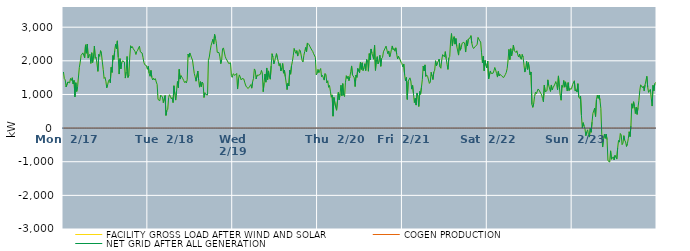
| Category | FACILITY GROSS LOAD AFTER WIND AND SOLAR | COGEN PRODUCTION | NET GRID AFTER ALL GENERATION |
|---|---|---|---|
|  Mon  2/17 | 1668 | 0 | 1668 |
|  Mon  2/17 | 1466 | 0 | 1466 |
|  Mon  2/17 | 1435 | 0 | 1435 |
|  Mon  2/17 | 1223 | 0 | 1223 |
|  Mon  2/17 | 1209 | 0 | 1209 |
|  Mon  2/17 | 1372 | 0 | 1372 |
|  Mon  2/17 | 1377 | 0 | 1377 |
|  Mon  2/17 | 1343 | 0 | 1343 |
|  Mon  2/17 | 1476 | 0 | 1476 |
|  Mon  2/17 | 1417 | 0 | 1417 |
|  Mon  2/17 | 1497 | 0 | 1497 |
|  Mon  2/17 | 1312 | 0 | 1312 |
|  Mon  2/17 | 1415 | 0 | 1415 |
|  Mon  2/17 | 928 | 0 | 928 |
|  Mon  2/17 | 1349 | 0 | 1349 |
|  Mon  2/17 | 1090 | 0 | 1090 |
|  Mon  2/17 | 1233 | 0 | 1233 |
|  Mon  2/17 | 1243 | 0 | 1243 |
|  Mon  2/17 | 1807 | 0 | 1807 |
|  Mon  2/17 | 1965 | 0 | 1965 |
|  Mon  2/17 | 2161 | 0 | 2161 |
|  Mon  2/17 | 2158 | 0 | 2158 |
|  Mon  2/17 | 2236 | 0 | 2236 |
|  Mon  2/17 | 2240 | 0 | 2240 |
|  Mon  2/17 | 2091 | 0 | 2091 |
|  Mon  2/17 | 2475 | 0 | 2475 |
|  Mon  2/17 | 2226 | 0 | 2226 |
|  Mon  2/17 | 2500 | 0 | 2500 |
|  Mon  2/17 | 2082 | 0 | 2082 |
|  Mon  2/17 | 2163 | 0 | 2163 |
|  Mon  2/17 | 2196 | 0 | 2196 |
|  Mon  2/17 | 1923 | 0 | 1923 |
|  Mon  2/17 | 2239 | 0 | 2239 |
|  Mon  2/17 | 1948 | 0 | 1948 |
|  Mon  2/17 | 2140 | 0 | 2140 |
|  Mon  2/17 | 2438 | 0 | 2438 |
|  Mon  2/17 | 2075 | 0 | 2075 |
|  Mon  2/17 | 2105 | 0 | 2105 |
|  Mon  2/17 | 2108 | 0 | 2108 |
|  Mon  2/17 | 1687 | 0 | 1687 |
|  Mon  2/17 | 2190 | 0 | 2190 |
|  Mon  2/17 | 2135 | 0 | 2135 |
|  Mon  2/17 | 2302 | 0 | 2302 |
|  Mon  2/17 | 2210 | 0 | 2210 |
|  Mon  2/17 | 1966 | 0 | 1966 |
|  Mon  2/17 | 1742 | 0 | 1742 |
|  Mon  2/17 | 1477 | 0 | 1477 |
|  Mon  2/17 | 1508 | 0 | 1508 |
|  Mon  2/17 | 1395 | 0 | 1395 |
|  Mon  2/17 | 1198 | 0 | 1198 |
|  Mon  2/17 | 1291 | 0 | 1291 |
|  Mon  2/17 | 1396 | 0 | 1396 |
|  Mon  2/17 | 1446 | 0 | 1446 |
|  Mon  2/17 | 1346 | 0 | 1346 |
|  Mon  2/17 | 1807 | 0 | 1807 |
|  Mon  2/17 | 1655 | 0 | 1655 |
|  Mon  2/17 | 2157 | 0 | 2157 |
|  Mon  2/17 | 2039 | 0 | 2039 |
|  Mon  2/17 | 2305 | 0 | 2305 |
|  Mon  2/17 | 2492 | 0 | 2492 |
|  Mon  2/17 | 2362 | 0 | 2362 |
|  Mon  2/17 | 2593 | 0 | 2593 |
|  Mon  2/17 | 2104 | 0 | 2104 |
|  Mon  2/17 | 1607 | 0 | 1607 |
|  Mon  2/17 | 2065 | 0 | 2065 |
|  Mon  2/17 | 1761 | 0 | 1761 |
|  Mon  2/17 | 1957 | 0 | 1957 |
|  Mon  2/17 | 2000 | 0 | 2000 |
|  Mon  2/17 | 2001 | 0 | 2001 |
|  Mon  2/17 | 1963 | 0 | 1963 |
|  Mon  2/17 | 1487 | 0 | 1487 |
|  Mon  2/17 | 1671 | 0 | 1671 |
|  Mon  2/17 | 2128 | 0 | 2128 |
|  Mon  2/17 | 1506 | 0 | 1506 |
|  Mon  2/17 | 1571 | 0 | 1571 |
|  Mon  2/17 | 2113 | 0 | 2113 |
|  Mon  2/17 | 2447 | 0 | 2447 |
|  Mon  2/17 | 2381 | 0 | 2381 |
|  Mon  2/17 | 2421 | 0 | 2421 |
|  Mon  2/17 | 2356 | 0 | 2356 |
|  Mon  2/17 | 2320 | 0 | 2320 |
|  Mon  2/17 | 2275 | 0 | 2275 |
|  Mon  2/17 | 2188 | 0 | 2188 |
|  Mon  2/17 | 2280 | 0 | 2280 |
|  Mon  2/17 | 2313 | 0 | 2313 |
|  Mon  2/17 | 2383 | 0 | 2383 |
|  Mon  2/17 | 2434 | 0 | 2434 |
|  Mon  2/17 | 2266 | 0 | 2266 |
|  Mon  2/17 | 2277 | 0 | 2277 |
|  Mon  2/17 | 2232 | 0 | 2232 |
|  Mon  2/17 | 2101 | 0 | 2101 |
|  Mon  2/17 | 1952 | 0 | 1952 |
|  Mon  2/17 | 1884 | 0 | 1884 |
|  Mon  2/17 | 1911 | 0 | 1911 |
|  Mon  2/17 | 1853 | 0 | 1853 |
|  Mon  2/17 | 1748 | 0 | 1748 |
|  Tue  2/18 | 1839 | 0 | 1839 |
|  Tue  2/18 | 1633 | 0 | 1633 |
|  Tue  2/18 | 1542 | 0 | 1542 |
|  Tue  2/18 | 1714 | 0 | 1714 |
|  Tue  2/18 | 1506 | 0 | 1506 |
|  Tue  2/18 | 1431 | 0 | 1431 |
|  Tue  2/18 | 1483 | 0 | 1483 |
|  Tue  2/18 | 1432 | 0 | 1432 |
|  Tue  2/18 | 1469 | 0 | 1469 |
|  Tue  2/18 | 1370 | 0 | 1370 |
|  Tue  2/18 | 1298 | 0 | 1298 |
|  Tue  2/18 | 852 | 0 | 852 |
|  Tue  2/18 | 879 | 0 | 879 |
|  Tue  2/18 | 813 | 0 | 813 |
|  Tue  2/18 | 980 | 0 | 980 |
|  Tue  2/18 | 955 | 0 | 955 |
|  Tue  2/18 | 923 | 0 | 923 |
|  Tue  2/18 | 757 | 0 | 757 |
|  Tue  2/18 | 760 | 0 | 760 |
|  Tue  2/18 | 967 | 0 | 967 |
|  Tue  2/18 | 377 | 0 | 377 |
|  Tue  2/18 | 525 | 0 | 525 |
|  Tue  2/18 | 559 | 0 | 559 |
|  Tue  2/18 | 909 | 0 | 909 |
|  Tue  2/18 | 990 | 0 | 990 |
|  Tue  2/18 | 945 | 0 | 945 |
|  Tue  2/18 | 871 | 0 | 871 |
|  Tue  2/18 | 906 | 0 | 906 |
|  Tue  2/18 | 758 | 0 | 758 |
|  Tue  2/18 | 1258 | 0 | 1258 |
|  Tue  2/18 | 1016 | 0 | 1016 |
|  Tue  2/18 | 832 | 0 | 832 |
|  Tue  2/18 | 1120 | 0 | 1120 |
|  Tue  2/18 | 1384 | 0 | 1384 |
|  Tue  2/18 | 1200 | 0 | 1200 |
|  Tue  2/18 | 1746 | 0 | 1746 |
|  Tue  2/18 | 1457 | 0 | 1457 |
|  Tue  2/18 | 1559 | 0 | 1559 |
|  Tue  2/18 | 1517 | 0 | 1517 |
|  Tue  2/18 | 1468 | 0 | 1468 |
|  Tue  2/18 | 1416 | 0 | 1416 |
|  Tue  2/18 | 1356 | 0 | 1356 |
|  Tue  2/18 | 1387 | 0 | 1387 |
|  Tue  2/18 | 1340 | 0 | 1340 |
|  Tue  2/18 | 1436 | 0 | 1436 |
|  Tue  2/18 | 2199 | 0 | 2199 |
|  Tue  2/18 | 2108 | 0 | 2108 |
|  Tue  2/18 | 2233 | 0 | 2233 |
|  Tue  2/18 | 2243 | 0 | 2243 |
|  Tue  2/18 | 2086 | 0 | 2086 |
|  Tue  2/18 | 2020 | 0 | 2020 |
|  Tue  2/18 | 2032 | 0 | 2032 |
|  Tue  2/18 | 1625 | 0 | 1625 |
|  Tue  2/18 | 1526 | 0 | 1526 |
|  Tue  2/18 | 1394 | 0 | 1394 |
|  Tue  2/18 | 1370 | 0 | 1370 |
|  Tue  2/18 | 1694 | 0 | 1694 |
|  Tue  2/18 | 1416 | 0 | 1416 |
|  Tue  2/18 | 1217 | 0 | 1217 |
|  Tue  2/18 | 1380 | 0 | 1380 |
|  Tue  2/18 | 1230 | 0 | 1230 |
|  Tue  2/18 | 1370 | 0 | 1370 |
|  Tue  2/18 | 1326 | 0 | 1326 |
|  Tue  2/18 | 910 | 0 | 910 |
|  Tue  2/18 | 1052 | 0 | 1052 |
|  Tue  2/18 | 1000 | 0 | 1000 |
|  Tue  2/18 | 994 | 0 | 994 |
|  Tue  2/18 | 984 | 0 | 984 |
|  Tue  2/18 | 2013 | 0 | 2013 |
|  Tue  2/18 | 2111 | 0 | 2111 |
|  Tue  2/18 | 2296 | 0 | 2296 |
|  Tue  2/18 | 2450 | 0 | 2450 |
|  Tue  2/18 | 2439 | 0 | 2439 |
|  Tue  2/18 | 2637 | 0 | 2637 |
|  Tue  2/18 | 2498 | 0 | 2498 |
|  Tue  2/18 | 2785 | 0 | 2785 |
|  Tue  2/18 | 2671 | 0 | 2671 |
|  Tue  2/18 | 2523 | 0 | 2523 |
|  Tue  2/18 | 2252 | 0 | 2252 |
|  Tue  2/18 | 2264 | 0 | 2264 |
|  Tue  2/18 | 2245 | 0 | 2245 |
|  Tue  2/18 | 2116 | 0 | 2116 |
|  Tue  2/18 | 1915 | 0 | 1915 |
|  Tue  2/18 | 2027 | 0 | 2027 |
|  Tue  2/18 | 2353 | 0 | 2353 |
|  Tue  2/18 | 2384 | 0 | 2384 |
|  Tue  2/18 | 2382 | 0 | 2382 |
|  Tue  2/18 | 2133 | 0 | 2133 |
|  Tue  2/18 | 2062 | 0 | 2062 |
|  Tue  2/18 | 2019 | 0 | 2019 |
|  Tue  2/18 | 1998 | 0 | 1998 |
|  Tue  2/18 | 1919 | 0 | 1919 |
|  Tue  2/18 | 1948 | 0 | 1948 |
|  Tue  2/18 | 1940 | 0 | 1940 |
|  Tue  2/18 | 1557 | 0 | 1557 |
|  Tue  2/18 | 1509 | 0 | 1509 |
|  Wed  2/19 | 1616 | 0 | 1616 |
|  Wed  2/19 | 1636 | 0 | 1636 |
|  Wed  2/19 | 1566 | 0 | 1566 |
|  Wed  2/19 | 1560 | 0 | 1560 |
|  Wed  2/19 | 1624 | 0 | 1624 |
|  Wed  2/19 | 1161 | 0 | 1161 |
|  Wed  2/19 | 1460 | 0 | 1460 |
|  Wed  2/19 | 1582 | 0 | 1582 |
|  Wed  2/19 | 1520 | 0 | 1520 |
|  Wed  2/19 | 1434 | 0 | 1434 |
|  Wed  2/19 | 1472 | 0 | 1472 |
|  Wed  2/19 | 1466 | 0 | 1466 |
|  Wed  2/19 | 1461 | 0 | 1461 |
|  Wed  2/19 | 1367 | 0 | 1367 |
|  Wed  2/19 | 1281 | 0 | 1281 |
|  Wed  2/19 | 1225 | 0 | 1225 |
|  Wed  2/19 | 1228 | 0 | 1228 |
|  Wed  2/19 | 1177 | 0 | 1177 |
|  Wed  2/19 | 1167 | 0 | 1167 |
|  Wed  2/19 | 1248 | 0 | 1248 |
|  Wed  2/19 | 1293 | 0 | 1293 |
|  Wed  2/19 | 1187 | 0 | 1187 |
|  Wed  2/19 | 1376 | 0 | 1376 |
|  Wed  2/19 | 1476 | 0 | 1476 |
|  Wed  2/19 | 1759 | 0 | 1759 |
|  Wed  2/19 | 1714 | 0 | 1714 |
|  Wed  2/19 | 1460 | 0 | 1460 |
|  Wed  2/19 | 1570 | 0 | 1570 |
|  Wed  2/19 | 1572 | 0 | 1572 |
|  Wed  2/19 | 1574 | 0 | 1574 |
|  Wed  2/19 | 1590 | 0 | 1590 |
|  Wed  2/19 | 1604 | 0 | 1604 |
|  Wed  2/19 | 1715 | 0 | 1715 |
|  Wed  2/19 | 1639 | 0 | 1639 |
|  Wed  2/19 | 1083 | 0 | 1083 |
|  Wed  2/19 | 1357 | 0 | 1357 |
|  Wed  2/19 | 1607 | 0 | 1607 |
|  Wed  2/19 | 1365 | 0 | 1365 |
|  Wed  2/19 | 1787 | 0 | 1787 |
|  Wed  2/19 | 1440 | 0 | 1440 |
|  Wed  2/19 | 1700 | 0 | 1700 |
|  Wed  2/19 | 1511 | 0 | 1511 |
|  Wed  2/19 | 1453 | 0 | 1453 |
|  Wed  2/19 | 1845 | 0 | 1845 |
|  Wed  2/19 | 2211 | 0 | 2211 |
|  Wed  2/19 | 2112 | 0 | 2112 |
|  Wed  2/19 | 1909 | 0 | 1909 |
|  Wed  2/19 | 1990 | 0 | 1990 |
|  Wed  2/19 | 2108 | 0 | 2108 |
|  Wed  2/19 | 2213 | 0 | 2213 |
|  Wed  2/19 | 2090 | 0 | 2090 |
|  Wed  2/19 | 1986 | 0 | 1986 |
|  Wed  2/19 | 1851 | 0 | 1851 |
|  Wed  2/19 | 1921 | 0 | 1921 |
|  Wed  2/19 | 1701 | 0 | 1701 |
|  Wed  2/19 | 1785 | 0 | 1785 |
|  Wed  2/19 | 1920 | 0 | 1920 |
|  Wed  2/19 | 1633 | 0 | 1633 |
|  Wed  2/19 | 1719 | 0 | 1719 |
|  Wed  2/19 | 1527 | 0 | 1527 |
|  Wed  2/19 | 1343 | 0 | 1343 |
|  Wed  2/19 | 1145 | 0 | 1145 |
|  Wed  2/19 | 1332 | 0 | 1332 |
|  Wed  2/19 | 1252 | 0 | 1252 |
|  Wed  2/19 | 1726 | 0 | 1726 |
|  Wed  2/19 | 1602 | 0 | 1602 |
|  Wed  2/19 | 1851 | 0 | 1851 |
|  Wed  2/19 | 1979 | 0 | 1979 |
|  Wed  2/19 | 2150 | 0 | 2150 |
|  Wed  2/19 | 2365 | 0 | 2365 |
|  Wed  2/19 | 2285 | 0 | 2285 |
|  Wed  2/19 | 2222 | 0 | 2222 |
|  Wed  2/19 | 2303 | 0 | 2303 |
|  Wed  2/19 | 2141 | 0 | 2141 |
|  Wed  2/19 | 2187 | 0 | 2187 |
|  Wed  2/19 | 2331 | 0 | 2331 |
|  Wed  2/19 | 2297 | 0 | 2297 |
|  Wed  2/19 | 2303 | 0 | 2303 |
|  Wed  2/19 | 2014 | 0 | 2014 |
|  Wed  2/19 | 1964 | 0 | 1964 |
|  Wed  2/19 | 2161 | 0 | 2161 |
|  Wed  2/19 | 2280 | 0 | 2280 |
|  Wed  2/19 | 2397 | 0 | 2397 |
|  Wed  2/19 | 2265 | 0 | 2265 |
|  Wed  2/19 | 2531 | 0 | 2531 |
|  Wed  2/19 | 2551 | 0 | 2551 |
|  Wed  2/19 | 2474 | 0 | 2474 |
|  Wed  2/19 | 2415 | 0 | 2415 |
|  Wed  2/19 | 2389 | 0 | 2389 |
|  Wed  2/19 | 2320 | 0 | 2320 |
|  Wed  2/19 | 2278 | 0 | 2278 |
|  Wed  2/19 | 2211 | 0 | 2211 |
|  Wed  2/19 | 2217 | 0 | 2217 |
|  Wed  2/19 | 2104 | 0 | 2104 |
|  Wed  2/19 | 1580 | 0 | 1580 |
|  Wed  2/19 | 1620 | 0 | 1620 |
|  Thu  2/20 | 1741 | 0 | 1741 |
|  Thu  2/20 | 1649 | 0 | 1649 |
|  Thu  2/20 | 1721 | 0 | 1721 |
|  Thu  2/20 | 1771 | 0 | 1771 |
|  Thu  2/20 | 1525 | 0 | 1525 |
|  Thu  2/20 | 1569 | 0 | 1569 |
|  Thu  2/20 | 1540 | 0 | 1540 |
|  Thu  2/20 | 1427 | 0 | 1427 |
|  Thu  2/20 | 1620 | 0 | 1620 |
|  Thu  2/20 | 1584 | 0 | 1584 |
|  Thu  2/20 | 1343 | 0 | 1343 |
|  Thu  2/20 | 1406 | 0 | 1406 |
|  Thu  2/20 | 1211 | 0 | 1211 |
|  Thu  2/20 | 1267 | 0 | 1267 |
|  Thu  2/20 | 1099 | 0 | 1099 |
|  Thu  2/20 | 919 | 0 | 919 |
|  Thu  2/20 | 986 | 0 | 986 |
|  Thu  2/20 | 354 | 0 | 354 |
|  Thu  2/20 | 911 | 0 | 911 |
|  Thu  2/20 | 914 | 0 | 914 |
|  Thu  2/20 | 615 | 0 | 615 |
|  Thu  2/20 | 530 | 0 | 530 |
|  Thu  2/20 | 518 | 0 | 518 |
|  Thu  2/20 | 1060 | 0 | 1060 |
|  Thu  2/20 | 838 | 0 | 838 |
|  Thu  2/20 | 1031 | 0 | 1031 |
|  Thu  2/20 | 1275 | 0 | 1275 |
|  Thu  2/20 | 961 | 0 | 961 |
|  Thu  2/20 | 1322 | 0 | 1322 |
|  Thu  2/20 | 985 | 0 | 985 |
|  Thu  2/20 | 936 | 0 | 936 |
|  Thu  2/20 | 1346 | 0 | 1346 |
|  Thu  2/20 | 1557 | 0 | 1557 |
|  Thu  2/20 | 1472 | 0 | 1472 |
|  Thu  2/20 | 1546 | 0 | 1546 |
|  Thu  2/20 | 1408 | 0 | 1408 |
|  Thu  2/20 | 1516 | 0 | 1516 |
|  Thu  2/20 | 1674 | 0 | 1674 |
|  Thu  2/20 | 1848 | 0 | 1848 |
|  Thu  2/20 | 1580 | 0 | 1580 |
|  Thu  2/20 | 1574 | 0 | 1574 |
|  Thu  2/20 | 1493 | 0 | 1493 |
|  Thu  2/20 | 1235 | 0 | 1235 |
|  Thu  2/20 | 1578 | 0 | 1578 |
|  Thu  2/20 | 1509 | 0 | 1509 |
|  Thu  2/20 | 1773 | 0 | 1773 |
|  Thu  2/20 | 1788 | 0 | 1788 |
|  Thu  2/20 | 1647 | 0 | 1647 |
|  Thu  2/20 | 1956 | 0 | 1956 |
|  Thu  2/20 | 1744 | 0 | 1744 |
|  Thu  2/20 | 1942 | 0 | 1942 |
|  Thu  2/20 | 1713 | 0 | 1713 |
|  Thu  2/20 | 1788 | 0 | 1788 |
|  Thu  2/20 | 1913 | 0 | 1913 |
|  Thu  2/20 | 1712 | 0 | 1712 |
|  Thu  2/20 | 2045 | 0 | 2045 |
|  Thu  2/20 | 2006 | 0 | 2006 |
|  Thu  2/20 | 1691 | 0 | 1691 |
|  Thu  2/20 | 2214 | 0 | 2214 |
|  Thu  2/20 | 2026 | 0 | 2026 |
|  Thu  2/20 | 2352 | 0 | 2352 |
|  Thu  2/20 | 2229 | 0 | 2229 |
|  Thu  2/20 | 2240 | 0 | 2240 |
|  Thu  2/20 | 2047 | 0 | 2047 |
|  Thu  2/20 | 2459 | 0 | 2459 |
|  Thu  2/20 | 1716 | 0 | 1716 |
|  Thu  2/20 | 2033 | 0 | 2033 |
|  Thu  2/20 | 2124 | 0 | 2124 |
|  Thu  2/20 | 1909 | 0 | 1909 |
|  Thu  2/20 | 1979 | 0 | 1979 |
|  Thu  2/20 | 2164 | 0 | 2164 |
|  Thu  2/20 | 1837 | 0 | 1837 |
|  Thu  2/20 | 2071 | 0 | 2071 |
|  Thu  2/20 | 2101 | 0 | 2101 |
|  Thu  2/20 | 2267 | 0 | 2267 |
|  Thu  2/20 | 2279 | 0 | 2279 |
|  Thu  2/20 | 2381 | 0 | 2381 |
|  Thu  2/20 | 2438 | 0 | 2438 |
|  Thu  2/20 | 2317 | 0 | 2317 |
|  Thu  2/20 | 2209 | 0 | 2209 |
|  Thu  2/20 | 2293 | 0 | 2293 |
|  Thu  2/20 | 2115 | 0 | 2115 |
|  Thu  2/20 | 2192 | 0 | 2192 |
|  Thu  2/20 | 2330 | 0 | 2330 |
|  Thu  2/20 | 2442 | 0 | 2442 |
|  Thu  2/20 | 2331 | 0 | 2331 |
|  Thu  2/20 | 2365 | 0 | 2365 |
|  Thu  2/20 | 2286 | 0 | 2286 |
|  Thu  2/20 | 2387 | 0 | 2387 |
|  Thu  2/20 | 2200 | 0 | 2200 |
|  Thu  2/20 | 2055 | 0 | 2055 |
|  Thu  2/20 | 2138 | 0 | 2138 |
|  Thu  2/20 | 2089 | 0 | 2089 |
|  Thu  2/20 | 2103 | 0 | 2103 |
|  Thu  2/20 | 1955 | 0 | 1955 |
|  Thu  2/20 | 1916 | 0 | 1916 |
|  Fri  2/21 | 1816 | 0 | 1816 |
|  Fri  2/21 | 1904 | 0 | 1904 |
|  Fri  2/21 | 1585 | 0 | 1585 |
|  Fri  2/21 | 1405 | 0 | 1405 |
|  Fri  2/21 | 1503 | 0 | 1503 |
|  Fri  2/21 | 853 | 0 | 853 |
|  Fri  2/21 | 1391 | 0 | 1391 |
|  Fri  2/21 | 1394 | 0 | 1394 |
|  Fri  2/21 | 1494 | 0 | 1494 |
|  Fri  2/21 | 1400 | 0 | 1400 |
|  Fri  2/21 | 1159 | 0 | 1159 |
|  Fri  2/21 | 1268 | 0 | 1268 |
|  Fri  2/21 | 1024 | 0 | 1024 |
|  Fri  2/21 | 759 | 0 | 759 |
|  Fri  2/21 | 886 | 0 | 886 |
|  Fri  2/21 | 684 | 0 | 684 |
|  Fri  2/21 | 1044 | 0 | 1044 |
|  Fri  2/21 | 943 | 0 | 943 |
|  Fri  2/21 | 642 | 0 | 642 |
|  Fri  2/21 | 1086 | 0 | 1086 |
|  Fri  2/21 | 1006 | 0 | 1006 |
|  Fri  2/21 | 1211 | 0 | 1211 |
|  Fri  2/21 | 1438 | 0 | 1438 |
|  Fri  2/21 | 1843 | 0 | 1843 |
|  Fri  2/21 | 1701 | 0 | 1701 |
|  Fri  2/21 | 1879 | 0 | 1879 |
|  Fri  2/21 | 1535 | 0 | 1535 |
|  Fri  2/21 | 1576 | 0 | 1576 |
|  Fri  2/21 | 1536 | 0 | 1536 |
|  Fri  2/21 | 1552 | 0 | 1552 |
|  Fri  2/21 | 1329 | 0 | 1329 |
|  Fri  2/21 | 1366 | 0 | 1366 |
|  Fri  2/21 | 1657 | 0 | 1657 |
|  Fri  2/21 | 1549 | 0 | 1549 |
|  Fri  2/21 | 1443 | 0 | 1443 |
|  Fri  2/21 | 1665 | 0 | 1665 |
|  Fri  2/21 | 1721 | 0 | 1721 |
|  Fri  2/21 | 2001 | 0 | 2001 |
|  Fri  2/21 | 1850 | 0 | 1850 |
|  Fri  2/21 | 1933 | 0 | 1933 |
|  Fri  2/21 | 1985 | 0 | 1985 |
|  Fri  2/21 | 2052 | 0 | 2052 |
|  Fri  2/21 | 1821 | 0 | 1821 |
|  Fri  2/21 | 1779 | 0 | 1779 |
|  Fri  2/21 | 2027 | 0 | 2027 |
|  Fri  2/21 | 2184 | 0 | 2184 |
|  Fri  2/21 | 2203 | 0 | 2203 |
|  Fri  2/21 | 2117 | 0 | 2117 |
|  Fri  2/21 | 2272 | 0 | 2272 |
|  Fri  2/21 | 2067 | 0 | 2067 |
|  Fri  2/21 | 1893 | 0 | 1893 |
|  Fri  2/21 | 1745 | 0 | 1745 |
|  Fri  2/21 | 2083 | 0 | 2083 |
|  Fri  2/21 | 2132 | 0 | 2132 |
|  Fri  2/21 | 2589 | 0 | 2589 |
|  Fri  2/21 | 2810 | 0 | 2810 |
|  Fri  2/21 | 2446 | 0 | 2446 |
|  Fri  2/21 | 2641 | 0 | 2641 |
|  Fri  2/21 | 2720 | 0 | 2720 |
|  Fri  2/21 | 2496 | 0 | 2496 |
|  Fri  2/21 | 2663 | 0 | 2663 |
|  Fri  2/21 | 2427 | 0 | 2427 |
|  Fri  2/21 | 2422 | 0 | 2422 |
|  Fri  2/21 | 2170 | 0 | 2170 |
|  Fri  2/21 | 2516 | 0 | 2516 |
|  Fri  2/21 | 2315 | 0 | 2315 |
|  Fri  2/21 | 2394 | 0 | 2394 |
|  Fri  2/21 | 2523 | 0 | 2523 |
|  Fri  2/21 | 2530 | 0 | 2530 |
|  Fri  2/21 | 2553 | 0 | 2553 |
|  Fri  2/21 | 2500 | 0 | 2500 |
|  Fri  2/21 | 2261 | 0 | 2261 |
|  Fri  2/21 | 2600 | 0 | 2600 |
|  Fri  2/21 | 2443 | 0 | 2443 |
|  Fri  2/21 | 2647 | 0 | 2647 |
|  Fri  2/21 | 2621 | 0 | 2621 |
|  Fri  2/21 | 2681 | 0 | 2681 |
|  Fri  2/21 | 2748 | 0 | 2748 |
|  Fri  2/21 | 2524 | 0 | 2524 |
|  Fri  2/21 | 2413 | 0 | 2413 |
|  Fri  2/21 | 2366 | 0 | 2366 |
|  Fri  2/21 | 2384 | 0 | 2384 |
|  Fri  2/21 | 2433 | 0 | 2433 |
|  Fri  2/21 | 2420 | 0 | 2420 |
|  Fri  2/21 | 2480 | 0 | 2480 |
|  Fri  2/21 | 2696 | 0 | 2696 |
|  Fri  2/21 | 2672 | 0 | 2672 |
|  Fri  2/21 | 2594 | 0 | 2594 |
|  Fri  2/21 | 2559 | 0 | 2559 |
|  Fri  2/21 | 2238 | 0 | 2238 |
|  Fri  2/21 | 1935 | 0 | 1935 |
|  Fri  2/21 | 2139 | 0 | 2139 |
|  Fri  2/21 | 1703 | 0 | 1703 |
|  Fri  2/21 | 2010 | 0 | 2010 |
|  Fri  2/21 | 1862 | 0 | 1862 |
|  Fri  2/21 | 1791 | 0 | 1791 |
|  Sat  2/22 | 1986 | 0 | 1986 |
|  Sat  2/22 | 1459 | 0 | 1459 |
|  Sat  2/22 | 1431 | 0 | 1431 |
|  Sat  2/22 | 1698 | 0 | 1698 |
|  Sat  2/22 | 1624 | 0 | 1624 |
|  Sat  2/22 | 1603 | 0 | 1603 |
|  Sat  2/22 | 1630 | 0 | 1630 |
|  Sat  2/22 | 1701 | 0 | 1701 |
|  Sat  2/22 | 1802 | 0 | 1802 |
|  Sat  2/22 | 1726 | 0 | 1726 |
|  Sat  2/22 | 1622 | 0 | 1622 |
|  Sat  2/22 | 1517 | 0 | 1517 |
|  Sat  2/22 | 1684 | 0 | 1684 |
|  Sat  2/22 | 1549 | 0 | 1549 |
|  Sat  2/22 | 1599 | 0 | 1599 |
|  Sat  2/22 | 1572 | 0 | 1572 |
|  Sat  2/22 | 1542 | 0 | 1542 |
|  Sat  2/22 | 1562 | 0 | 1562 |
|  Sat  2/22 | 1503 | 0 | 1503 |
|  Sat  2/22 | 1515 | 0 | 1515 |
|  Sat  2/22 | 1595 | 0 | 1595 |
|  Sat  2/22 | 1656 | 0 | 1656 |
|  Sat  2/22 | 1773 | 0 | 1773 |
|  Sat  2/22 | 2015 | 0 | 2015 |
|  Sat  2/22 | 2339 | 0 | 2339 |
|  Sat  2/22 | 2036 | 0 | 2036 |
|  Sat  2/22 | 2359 | 0 | 2359 |
|  Sat  2/22 | 2143 | 0 | 2143 |
|  Sat  2/22 | 2302 | 0 | 2302 |
|  Sat  2/22 | 2470 | 0 | 2470 |
|  Sat  2/22 | 2301 | 0 | 2301 |
|  Sat  2/22 | 2293 | 0 | 2293 |
|  Sat  2/22 | 2246 | 0 | 2246 |
|  Sat  2/22 | 2299 | 0 | 2299 |
|  Sat  2/22 | 2177 | 0 | 2177 |
|  Sat  2/22 | 2113 | 0 | 2113 |
|  Sat  2/22 | 2202 | 0 | 2202 |
|  Sat  2/22 | 2085 | 0 | 2085 |
|  Sat  2/22 | 2046 | 0 | 2046 |
|  Sat  2/22 | 2189 | 0 | 2189 |
|  Sat  2/22 | 2109 | 0 | 2109 |
|  Sat  2/22 | 1871 | 0 | 1871 |
|  Sat  2/22 | 1666 | 0 | 1666 |
|  Sat  2/22 | 1785 | 0 | 1785 |
|  Sat  2/22 | 1983 | 0 | 1983 |
|  Sat  2/22 | 1745 | 0 | 1745 |
|  Sat  2/22 | 1946 | 0 | 1946 |
|  Sat  2/22 | 1965 | 0 | 1965 |
|  Sat  2/22 | 1582 | 0 | 1582 |
|  Sat  2/22 | 1668 | 0 | 1668 |
|  Sat  2/22 | 704 | 0 | 704 |
|  Sat  2/22 | 617 | 0 | 617 |
|  Sat  2/22 | 735 | 0 | 735 |
|  Sat  2/22 | 936 | 0 | 936 |
|  Sat  2/22 | 1066 | 0 | 1066 |
|  Sat  2/22 | 1021 | 0 | 1021 |
|  Sat  2/22 | 1033 | 0 | 1033 |
|  Sat  2/22 | 1163 | 0 | 1163 |
|  Sat  2/22 | 1132 | 0 | 1132 |
|  Sat  2/22 | 1147 | 0 | 1147 |
|  Sat  2/22 | 1033 | 0 | 1033 |
|  Sat  2/22 | 989 | 0 | 989 |
|  Sat  2/22 | 880 | 0 | 880 |
|  Sat  2/22 | 785 | 0 | 785 |
|  Sat  2/22 | 1274 | 0 | 1274 |
|  Sat  2/22 | 1081 | 0 | 1081 |
|  Sat  2/22 | 1070 | 0 | 1070 |
|  Sat  2/22 | 1112 | 0 | 1112 |
|  Sat  2/22 | 1434 | 0 | 1434 |
|  Sat  2/22 | 1264 | 0 | 1264 |
|  Sat  2/22 | 1267 | 0 | 1267 |
|  Sat  2/22 | 1090 | 0 | 1090 |
|  Sat  2/22 | 1282 | 0 | 1282 |
|  Sat  2/22 | 1137 | 0 | 1137 |
|  Sat  2/22 | 1203 | 0 | 1203 |
|  Sat  2/22 | 1184 | 0 | 1184 |
|  Sat  2/22 | 1309 | 0 | 1309 |
|  Sat  2/22 | 1383 | 0 | 1383 |
|  Sat  2/22 | 1294 | 0 | 1294 |
|  Sat  2/22 | 1139 | 0 | 1139 |
|  Sat  2/22 | 1551 | 0 | 1551 |
|  Sat  2/22 | 1227 | 0 | 1227 |
|  Sat  2/22 | 986 | 0 | 986 |
|  Sat  2/22 | 829 | 0 | 829 |
|  Sat  2/22 | 1268 | 0 | 1268 |
|  Sat  2/22 | 1214 | 0 | 1214 |
|  Sat  2/22 | 1414 | 0 | 1414 |
|  Sat  2/22 | 1217 | 0 | 1217 |
|  Sat  2/22 | 1374 | 0 | 1374 |
|  Sat  2/22 | 1211 | 0 | 1211 |
|  Sat  2/22 | 1102 | 0 | 1102 |
|  Sat  2/22 | 1352 | 0 | 1352 |
|  Sat  2/22 | 1117 | 0 | 1117 |
|  Sat  2/22 | 1180 | 0 | 1180 |
|  Sat  2/22 | 1148 | 0 | 1148 |
|  Sat  2/22 | 1183 | 0 | 1183 |
|  Sun  2/23 | 1291 | 0 | 1291 |
|  Sun  2/23 | 1288 | 0 | 1288 |
|  Sun  2/23 | 1406 | 0 | 1406 |
|  Sun  2/23 | 1102 | 0 | 1102 |
|  Sun  2/23 | 1144 | 0 | 1144 |
|  Sun  2/23 | 1071 | 0 | 1071 |
|  Sun  2/23 | 1320 | 0 | 1320 |
|  Sun  2/23 | 923 | 0 | 923 |
|  Sun  2/23 | 882 | 0 | 882 |
|  Sun  2/23 | 951 | 0 | 951 |
|  Sun  2/23 | 381 | 0 | 381 |
|  Sun  2/23 | 0 | 0 | 0 |
|  Sun  2/23 | 161 | 0 | 161 |
|  Sun  2/23 | 58 | 0 | 58 |
|  Sun  2/23 | -15 | 0 | -15 |
|  Sun  2/23 | -227 | 0 | -227 |
|  Sun  2/23 | -116 | 0 | -116 |
|  Sun  2/23 | -51 | 0 | -51 |
|  Sun  2/23 | -199 | 0 | -199 |
|  Sun  2/23 | -267 | 0 | -267 |
|  Sun  2/23 | -2 | 0 | -2 |
|  Sun  2/23 | -124 | 0 | -124 |
|  Sun  2/23 | 177 | 0 | 177 |
|  Sun  2/23 | 438 | 0 | 438 |
|  Sun  2/23 | 452 | 0 | 452 |
|  Sun  2/23 | 593 | 0 | 593 |
|  Sun  2/23 | 344 | 0 | 344 |
|  Sun  2/23 | 844 | 0 | 844 |
|  Sun  2/23 | 976 | 0 | 976 |
|  Sun  2/23 | 883 | 0 | 883 |
|  Sun  2/23 | 982 | 0 | 982 |
|  Sun  2/23 | 827 | 0 | 827 |
|  Sun  2/23 | 576 | 0 | 576 |
|  Sun  2/23 | -183 | 0 | -183 |
|  Sun  2/23 | -563 | 0 | -563 |
|  Sun  2/23 | -316 | 0 | -316 |
|  Sun  2/23 | -180 | 0 | -180 |
|  Sun  2/23 | -304 | 0 | -304 |
|  Sun  2/23 | -176 | 0 | -176 |
|  Sun  2/23 | -343 | 0 | -343 |
|  Sun  2/23 | -967 | 0 | -967 |
|  Sun  2/23 | -940 | 0 | -940 |
|  Sun  2/23 | -1008 | 0 | -1008 |
|  Sun  2/23 | -676 | 0 | -676 |
|  Sun  2/23 | -926 | 0 | -926 |
|  Sun  2/23 | -927 | 0 | -927 |
|  Sun  2/23 | -855 | 0 | -855 |
|  Sun  2/23 | -949 | 0 | -949 |
|  Sun  2/23 | -809 | 0 | -809 |
|  Sun  2/23 | -838 | 0 | -838 |
|  Sun  2/23 | -921 | 0 | -921 |
|  Sun  2/23 | -590 | 0 | -590 |
|  Sun  2/23 | -366 | 0 | -366 |
|  Sun  2/23 | -418 | 0 | -418 |
|  Sun  2/23 | -160 | 0 | -160 |
|  Sun  2/23 | -205 | 0 | -205 |
|  Sun  2/23 | -493 | 0 | -493 |
|  Sun  2/23 | -445 | 0 | -445 |
|  Sun  2/23 | -226 | 0 | -226 |
|  Sun  2/23 | -367 | 0 | -367 |
|  Sun  2/23 | -413 | 0 | -413 |
|  Sun  2/23 | -545 | 0 | -545 |
|  Sun  2/23 | -464 | 0 | -464 |
|  Sun  2/23 | -318 | 0 | -318 |
|  Sun  2/23 | -109 | 0 | -109 |
|  Sun  2/23 | -253 | 0 | -253 |
|  Sun  2/23 | 67 | 0 | 67 |
|  Sun  2/23 | 724 | 0 | 724 |
|  Sun  2/23 | 592 | 0 | 592 |
|  Sun  2/23 | 782 | 0 | 782 |
|  Sun  2/23 | 637 | 0 | 637 |
|  Sun  2/23 | 434 | 0 | 434 |
|  Sun  2/23 | 618 | 0 | 618 |
|  Sun  2/23 | 408 | 0 | 408 |
|  Sun  2/23 | 611 | 0 | 611 |
|  Sun  2/23 | 816 | 0 | 816 |
|  Sun  2/23 | 1108 | 0 | 1108 |
|  Sun  2/23 | 1287 | 0 | 1287 |
|  Sun  2/23 | 1267 | 0 | 1267 |
|  Sun  2/23 | 1204 | 0 | 1204 |
|  Sun  2/23 | 1246 | 0 | 1246 |
|  Sun  2/23 | 1107 | 0 | 1107 |
|  Sun  2/23 | 1287 | 0 | 1287 |
|  Sun  2/23 | 1262 | 0 | 1262 |
|  Sun  2/23 | 1539 | 0 | 1539 |
|  Sun  2/23 | 1213 | 0 | 1213 |
|  Sun  2/23 | 1061 | 0 | 1061 |
|  Sun  2/23 | 1110 | 0 | 1110 |
|  Sun  2/23 | 1152 | 0 | 1152 |
|  Sun  2/23 | 893 | 0 | 893 |
|  Sun  2/23 | 655 | 0 | 655 |
|  Sun  2/23 | 1271 | 0 | 1271 |
|  Sun  2/23 | 1110 | 0 | 1110 |
|  Sun  2/23 | 1321 | 0 | 1321 |
|  Sun  2/23 | 1356 | 0 | 1356 |
|  Sun  2/23 | 1368 | 0 | 1368 |